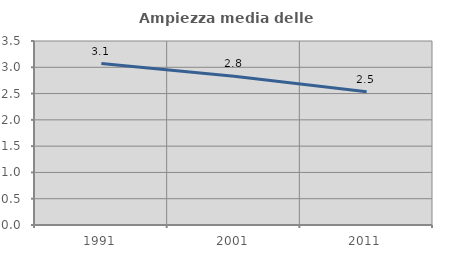
| Category | Ampiezza media delle famiglie |
|---|---|
| 1991.0 | 3.07 |
| 2001.0 | 2.83 |
| 2011.0 | 2.537 |